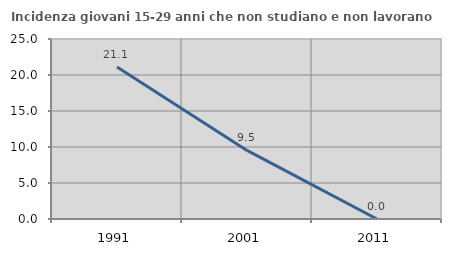
| Category | Incidenza giovani 15-29 anni che non studiano e non lavorano  |
|---|---|
| 1991.0 | 21.111 |
| 2001.0 | 9.524 |
| 2011.0 | 0 |